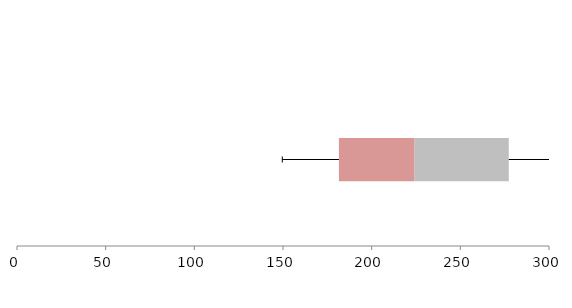
| Category | Series 1 | Series 2 | Series 3 |
|---|---|---|---|
| 0 | 181.538 | 42.681 | 53.1 |